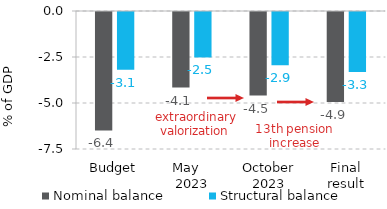
| Category | Nominal balance | Structural balance |
|---|---|---|
| Budget | -6.436 | -3.136 |
| May    2023 | -4.108 | -2.47 |
| October 2023 | -4.538 | -2.9 |
| Final result | -4.893 | -3.255 |